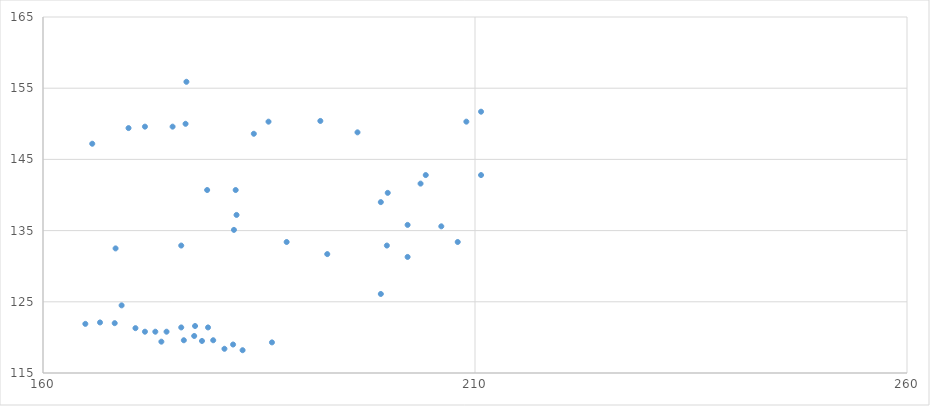
| Category | Series 0 |
|---|---|
| 176.3 | 119.6 |
| 178.4 | 119.5 |
| 181.0 | 118.4 |
| 183.1 | 118.2 |
| 186.5 | 119.3 |
| 170.7 | 121.3 |
| 168.3 | 122 |
| 164.9 | 121.9 |
| 166.6 | 122.1 |
| 176.0 | 121.4 |
| 169.1 | 124.5 |
| 199.1 | 126.1 |
| 192.9 | 131.7 |
| 168.4 | 132.5 |
| 202.2 | 131.3 |
| 199.8 | 132.9 |
| 176.0 | 132.9 |
| 188.2 | 133.4 |
| 208.0 | 133.4 |
| 182.1 | 135.1 |
| 206.1 | 135.6 |
| 202.2 | 135.8 |
| 182.4 | 137.2 |
| 199.1 | 139 |
| 179.0 | 140.7 |
| 182.3 | 140.7 |
| 199.9 | 140.3 |
| 204.3 | 142.8 |
| 210.7 | 142.8 |
| 165.7 | 147.2 |
| 184.4 | 148.6 |
| 196.4 | 148.8 |
| 169.9 | 149.4 |
| 171.8 | 149.6 |
| 186.1 | 150.3 |
| 192.1 | 150.4 |
| 209.0 | 150.3 |
| 210.7 | 151.7 |
| 176.6 | 155.9 |
| 175.0 | 149.6 |
| 176.5 | 150 |
| 203.7 | 141.6 |
| 171.8 | 120.8 |
| 173.7 | 119.4 |
| 179.1 | 121.4 |
| 177.6 | 121.6 |
| 179.7 | 119.6 |
| 182.0 | 119 |
| 177.5 | 120.2 |
| 173.0 | 120.8 |
| 174.3 | 120.8 |